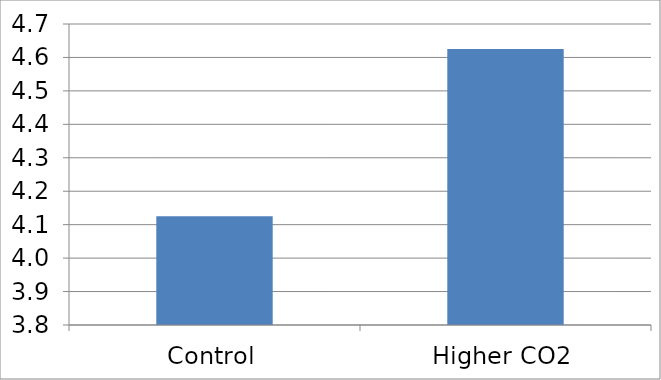
| Category | Series 0 |
|---|---|
| Control | 4.125 |
| Higher CO2 | 4.625 |